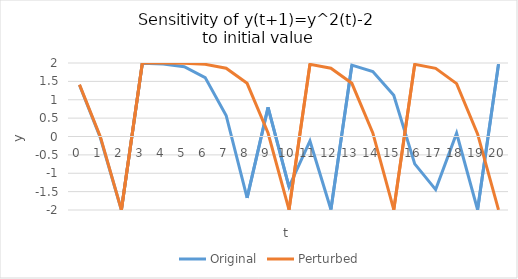
| Category | Original | Perturbed |
|---|---|---|
| 0.0 | 1.4 | 1.41 |
| 1.0 | -0.04 | -0.012 |
| 2.0 | -1.998 | -2 |
| 3.0 | 1.994 | 1.999 |
| 4.0 | 1.974 | 1.998 |
| 5.0 | 1.898 | 1.991 |
| 6.0 | 1.604 | 1.964 |
| 7.0 | 0.573 | 1.857 |
| 8.0 | -1.671 | 1.447 |
| 9.0 | 0.793 | 0.095 |
| 10.0 | -1.37 | -1.991 |
| 11.0 | -0.122 | 1.964 |
| 12.0 | -1.985 | 1.857 |
| 13.0 | 1.941 | 1.448 |
| 14.0 | 1.766 | 0.096 |
| 15.0 | 1.12 | -1.991 |
| 16.0 | -0.745 | 1.963 |
| 17.0 | -1.445 | 1.854 |
| 18.0 | 0.089 | 1.439 |
| 19.0 | -1.992 | 0.069 |
| 20.0 | 1.969 | -1.995 |